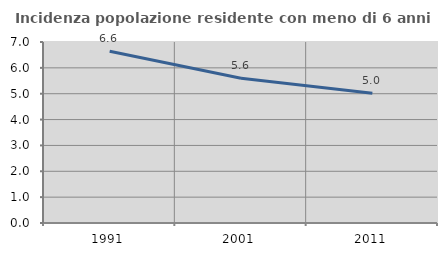
| Category | Incidenza popolazione residente con meno di 6 anni |
|---|---|
| 1991.0 | 6.639 |
| 2001.0 | 5.598 |
| 2011.0 | 5.015 |